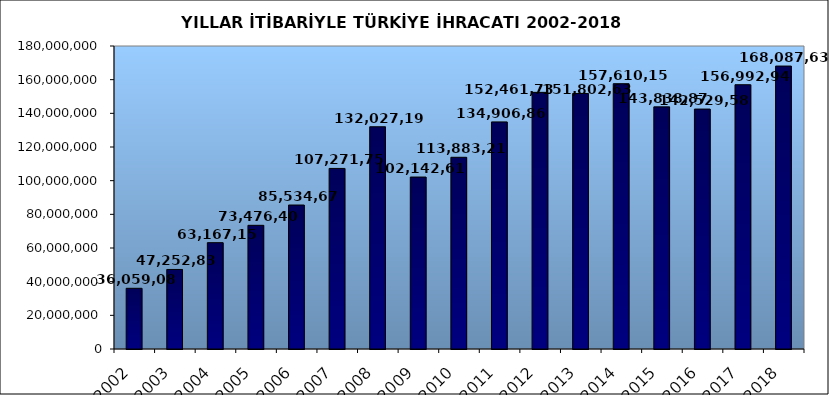
| Category | 2002 |
|---|---|
| 2002.0 | 36059089.029 |
| 2003.0 | 47252836.302 |
| 2004.0 | 63167152.82 |
| 2005.0 | 73476408.143 |
| 2006.0 | 85534675.518 |
| 2007.0 | 107271749.904 |
| 2008.0 | 132027195.626 |
| 2009.0 | 102142612.603 |
| 2010.0 | 113883219.184 |
| 2011.0 | 134906868.83 |
| 2012.0 | 152461736.556 |
| 2013.0 | 151802637.087 |
| 2014.0 | 157610157.69 |
| 2015.0 | 143838871.428 |
| 2016.0 | 142529583.808 |
| 2017.0 | 156992940.414 |
| 2018.0 | 168087636.652 |